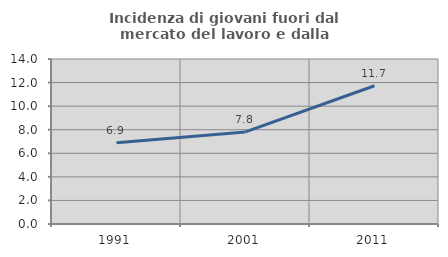
| Category | Incidenza di giovani fuori dal mercato del lavoro e dalla formazione  |
|---|---|
| 1991.0 | 6.888 |
| 2001.0 | 7.815 |
| 2011.0 | 11.733 |